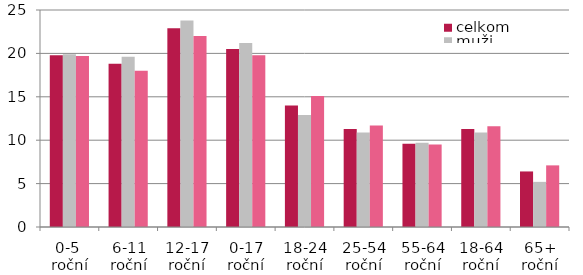
| Category | celkom | muži | ženy |
|---|---|---|---|
| 0-5  roční | 19.8 | 19.9 | 19.7 |
| 6-11 roční | 18.8 | 19.6 | 18 |
| 12-17 roční | 22.9 | 23.8 | 22 |
| 0-17 roční | 20.5 | 21.2 | 19.8 |
| 18-24 roční | 14 | 12.9 | 15.1 |
| 25-54 roční | 11.3 | 10.9 | 11.7 |
| 55-64 roční | 9.6 | 9.7 | 9.5 |
| 18-64 roční | 11.3 | 10.9 | 11.6 |
| 65+ roční | 6.4 | 5.2 | 7.1 |